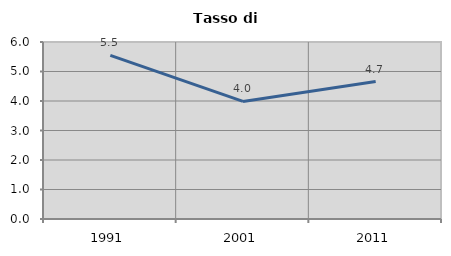
| Category | Tasso di disoccupazione   |
|---|---|
| 1991.0 | 5.548 |
| 2001.0 | 3.986 |
| 2011.0 | 4.658 |